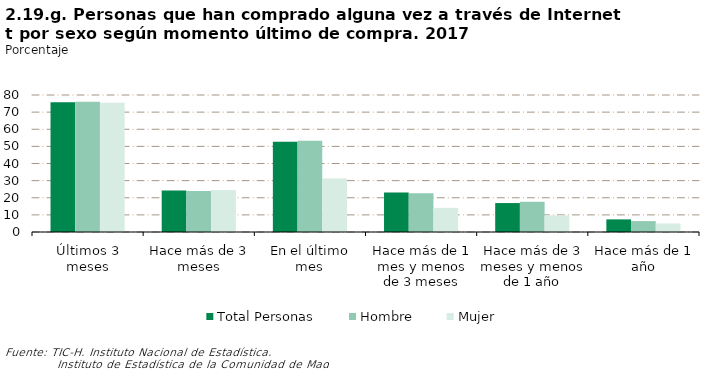
| Category | Total Personas | Hombre | Mujer |
|---|---|---|---|
| Últimos 3 meses | 75.732 | 75.987 | 75.485 |
| Hace más de 3 meses | 24.268 | 24.013 | 24.515 |
| En el último mes | 52.635 | 53.3 | 31.195 |
| Hace más de 1 mes y menos de 3 meses | 23.097 | 22.688 | 14.096 |
| Hace más de 3 meses y menos de 1 año | 16.902 | 17.643 | 9.711 |
| Hace más de 1 año | 7.366 | 6.37 | 4.998 |